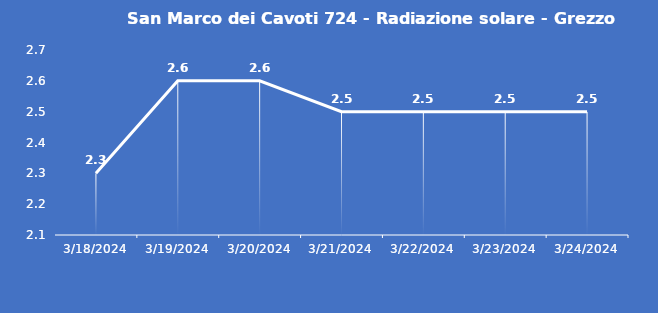
| Category | San Marco dei Cavoti 724 - Radiazione solare - Grezzo (W/m2) |
|---|---|
| 3/18/24 | 2.3 |
| 3/19/24 | 2.6 |
| 3/20/24 | 2.6 |
| 3/21/24 | 2.5 |
| 3/22/24 | 2.5 |
| 3/23/24 | 2.5 |
| 3/24/24 | 2.5 |